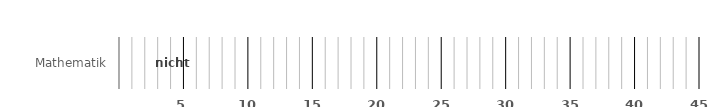
| Category | nicht empfohlen |
|---|---|
| Mathematik | 0 |